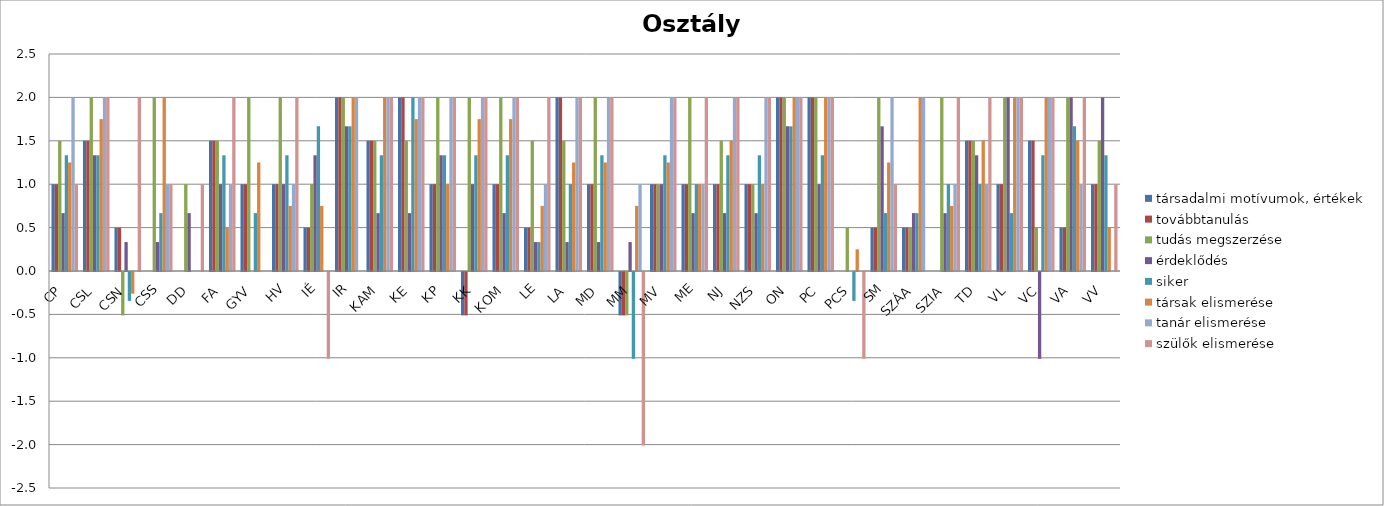
| Category | társadalmi motívumok, értékek | továbbtanulás | tudás megszerzése | érdeklődés | siker | társak elismerése | tanár elismerése | szülők elismerése |
|---|---|---|---|---|---|---|---|---|
| CP | 1 | 1 | 1.5 | 0.667 | 1.333 | 1.25 | 2 | 1 |
| CSL | 1.5 | 1.5 | 2 | 1.333 | 1.333 | 1.75 | 2 | 2 |
| CSN | 0.5 | 0.5 | -0.5 | 0.333 | -0.333 | -0.25 | 0 | 2 |
| CSS | 0 | 0 | 2 | 0.333 | 0.667 | 2 | 1 | 1 |
| DD | 0 | 0 | 1 | 0.667 | 0 | 0 | 0 | 1 |
| FA | 1.5 | 1.5 | 1.5 | 1 | 1.333 | 0.5 | 1 | 2 |
| GYV | 1 | 1 | 2 | 0 | 0.667 | 1.25 | 0 | 0 |
| HV | 1 | 1 | 2 | 1 | 1.333 | 0.75 | 1 | 2 |
| IÉ | 0.5 | 0.5 | 1 | 1.333 | 1.667 | 0.75 | 0 | -1 |
| IR | 2 | 2 | 2 | 1.667 | 1.667 | 2 | 2 | 0 |
| KAM | 1.5 | 1.5 | 1.5 | 0.667 | 1.333 | 2 | 2 | 2 |
| KE | 2 | 2 | 1.5 | 0.667 | 2 | 1.75 | 2 | 2 |
| KP | 1 | 1 | 2 | 1.333 | 1.333 | 1 | 2 | 2 |
| KK | -0.5 | -0.5 | 2 | 1 | 1.333 | 1.75 | 2 | 2 |
| KOM | 1 | 1 | 2 | 0.667 | 1.333 | 1.75 | 2 | 2 |
| LE | 0.5 | 0.5 | 1.5 | 0.333 | 0.333 | 0.75 | 1 | 2 |
| LA | 2 | 2 | 1.5 | 0.333 | 1 | 1.25 | 2 | 2 |
| MD | 1 | 1 | 2 | 0.333 | 1.333 | 1.25 | 2 | 2 |
| MM | -0.5 | -0.5 | -0.5 | 0.333 | -1 | 0.75 | 1 | -2 |
| MV | 1 | 1 | 1 | 1 | 1.333 | 1.25 | 2 | 2 |
| ME | 1 | 1 | 2 | 0.667 | 1 | 1 | 1 | 2 |
| NJ | 1 | 1 | 1.5 | 0.667 | 1.333 | 1.5 | 2 | 2 |
| NZS | 1 | 1 | 1 | 0.667 | 1.333 | 1 | 2 | 2 |
| ON | 2 | 2 | 2 | 1.667 | 1.667 | 2 | 2 | 2 |
| PC | 2 | 2 | 2 | 1 | 1.333 | 2 | 2 | 2 |
| PCS | 0 | 0 | 0.5 | 0 | -0.333 | 0.25 | 0 | -1 |
| SM | 0.5 | 0.5 | 2 | 1.667 | 0.667 | 1.25 | 2 | 1 |
| SZÁA | 0.5 | 0.5 | 0.5 | 0.667 | 0.667 | 2 | 2 | 0 |
| SZIA | 0 | 0 | 2 | 0.667 | 1 | 0.75 | 1 | 2 |
| TD | 1.5 | 1.5 | 1.5 | 1.333 | 1 | 1.5 | 1 | 2 |
| VL | 1 | 1 | 2 | 2 | 0.667 | 2 | 2 | 2 |
| VC | 1.5 | 1.5 | 0.5 | -1 | 1.333 | 2 | 2 | 2 |
| VA | 0.5 | 0.5 | 2 | 2 | 1.667 | 1.5 | 1 | 2 |
| VV | 1 | 1 | 1.5 | 2 | 1.333 | 0.5 | 0 | 1 |